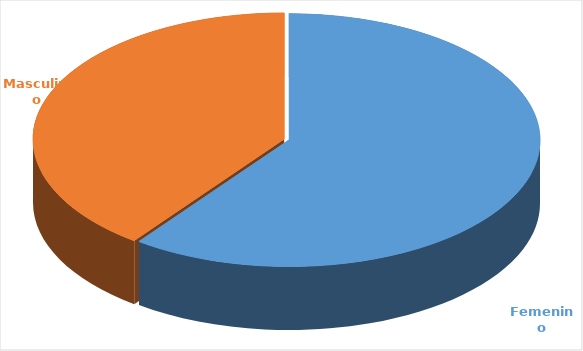
| Category | Cantidad  |
|---|---|
| Femenino | 3751 |
| Masculino | 2482 |